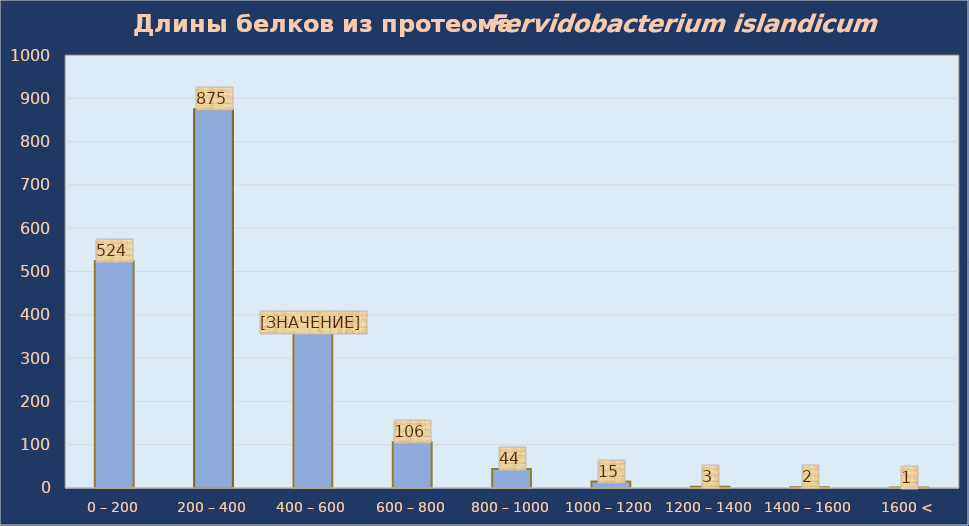
| Category | Series 0 |
|---|---|
| 0 – 200 | 524 |
| 200 – 400 | 875 |
| 400 – 600 | 358 |
| 600 – 800 | 106 |
| 800 – 1000 | 44 |
| 1000 – 1200 | 15 |
| 1200 – 1400 | 3 |
| 1400 – 1600 | 2 |
| 1600 < | 1 |